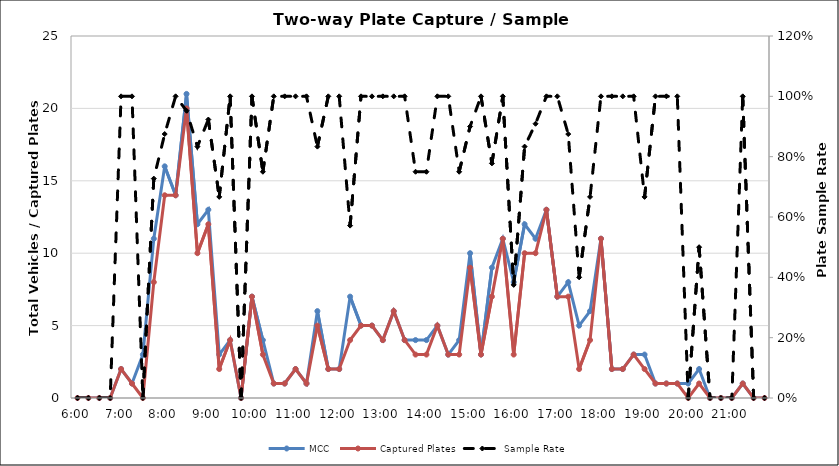
| Category | MCC | Captured Plates |
|---|---|---|
| 0.25 | 0 | 0 |
| 0.260416666666667 | 0 | 0 |
| 0.270833333333333 | 0 | 0 |
| 0.28125 | 0 | 0 |
| 0.291666666666667 | 2 | 2 |
| 0.302083333333333 | 1 | 1 |
| 0.3125 | 3 | 0 |
| 0.322916666666667 | 11 | 8 |
| 0.333333333333333 | 16 | 14 |
| 0.34375 | 14 | 14 |
| 0.354166666666667 | 21 | 20 |
| 0.364583333333333 | 12 | 10 |
| 0.375 | 13 | 12 |
| 0.385416666666667 | 3 | 2 |
| 0.395833333333333 | 4 | 4 |
| 0.40625 | 0 | 0 |
| 0.416666666666667 | 7 | 7 |
| 0.427083333333333 | 4 | 3 |
| 0.4375 | 1 | 1 |
| 0.447916666666667 | 1 | 1 |
| 0.458333333333333 | 2 | 2 |
| 0.46875 | 1 | 1 |
| 0.479166666666667 | 6 | 5 |
| 0.489583333333333 | 2 | 2 |
| 0.5 | 2 | 2 |
| 0.510416666666667 | 7 | 4 |
| 0.520833333333333 | 5 | 5 |
| 0.53125 | 5 | 5 |
| 0.541666666666667 | 4 | 4 |
| 0.552083333333333 | 6 | 6 |
| 0.5625 | 4 | 4 |
| 0.572916666666667 | 4 | 3 |
| 0.583333333333333 | 4 | 3 |
| 0.59375 | 5 | 5 |
| 0.604166666666667 | 3 | 3 |
| 0.614583333333333 | 4 | 3 |
| 0.625 | 10 | 9 |
| 0.635416666666667 | 3 | 3 |
| 0.645833333333333 | 9 | 7 |
| 0.65625 | 11 | 11 |
| 0.666666666666667 | 8 | 3 |
| 0.677083333333333 | 12 | 10 |
| 0.6875 | 11 | 10 |
| 0.697916666666667 | 13 | 13 |
| 0.708333333333333 | 7 | 7 |
| 0.71875 | 8 | 7 |
| 0.729166666666667 | 5 | 2 |
| 0.739583333333333 | 6 | 4 |
| 0.75 | 11 | 11 |
| 0.760416666666667 | 2 | 2 |
| 0.770833333333333 | 2 | 2 |
| 0.78125 | 3 | 3 |
| 0.791666666666667 | 3 | 2 |
| 0.802083333333333 | 1 | 1 |
| 0.8125 | 1 | 1 |
| 0.822916666666667 | 1 | 1 |
| 0.833333333333333 | 1 | 0 |
| 0.84375 | 2 | 1 |
| 0.854166666666667 | 0 | 0 |
| 0.864583333333333 | 0 | 0 |
| 0.875 | 0 | 0 |
| 0.885416666666667 | 1 | 1 |
| 0.895833333333333 | 0 | 0 |
| 0.90625 | 0 | 0 |